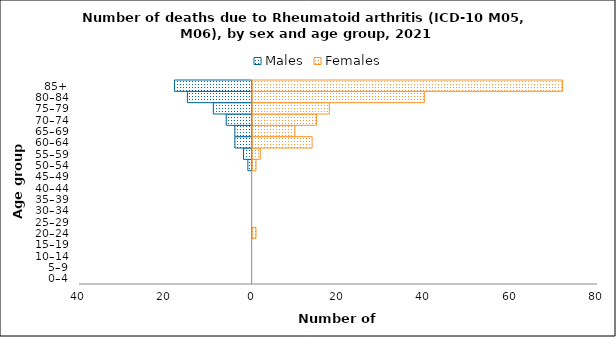
| Category | Males | Females |
|---|---|---|
| 0–4 | 0 | 0 |
| 5–9 | 0 | 0 |
| 10–14 | 0 | 0 |
| 15–19 | 0 | 0 |
| 20–24 | 0 | 1 |
| 25–29 | 0 | 0 |
| 30–34 | 0 | 0 |
| 35–39 | 0 | 0 |
| 40–44 | 0 | 0 |
| 45–49 | 0 | 0 |
| 50–54 | -1 | 1 |
| 55–59 | -2 | 2 |
| 60–64 | -4 | 14 |
| 65–69 | -4 | 10 |
| 70–74 | -6 | 15 |
| 75–79 | -9 | 18 |
| 80–84 | -15 | 40 |
| 85+ | -18 | 72 |